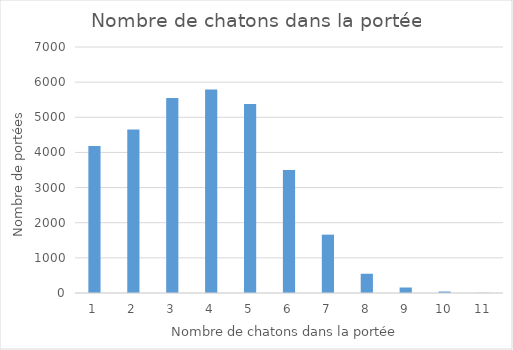
| Category | Series 0 |
|---|---|
| 1.0 | 4185 |
| 2.0 | 4653 |
| 3.0 | 5549 |
| 4.0 | 5794 |
| 5.0 | 5380 |
| 6.0 | 3497 |
| 7.0 | 1660 |
| 8.0 | 548 |
| 9.0 | 156 |
| 10.0 | 42 |
| 11.0 | 6 |